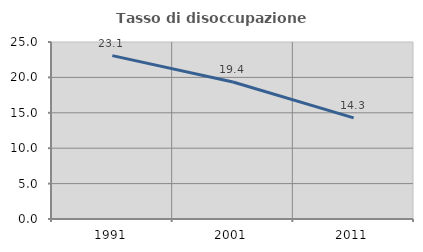
| Category | Tasso di disoccupazione giovanile  |
|---|---|
| 1991.0 | 23.077 |
| 2001.0 | 19.355 |
| 2011.0 | 14.286 |